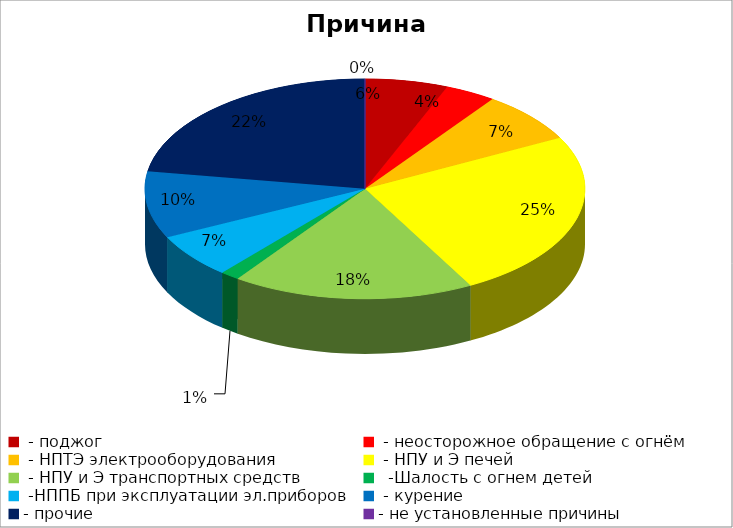
| Category | Причина пожара |
|---|---|
|  - поджог | 13 |
|  - неосторожное обращение с огнём | 8 |
|  - НПТЭ электрооборудования | 16 |
|  - НПУ и Э печей | 53 |
|  - НПУ и Э транспортных средств | 38 |
|   -Шалость с огнем детей | 3 |
|  -НППБ при эксплуатации эл.приборов | 14 |
|  - курение | 21 |
| - прочие | 48 |
| - не установленные причины | 0 |